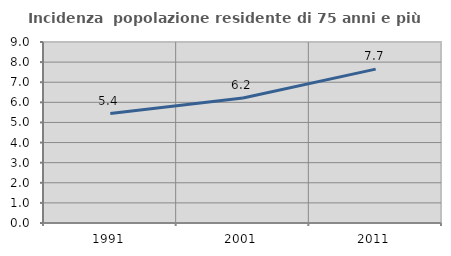
| Category | Incidenza  popolazione residente di 75 anni e più |
|---|---|
| 1991.0 | 5.444 |
| 2001.0 | 6.218 |
| 2011.0 | 7.652 |